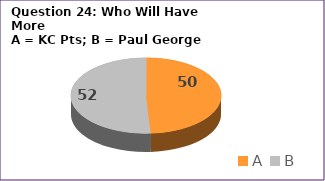
| Category | Series 0 |
|---|---|
| A | 50 |
| B | 52 |